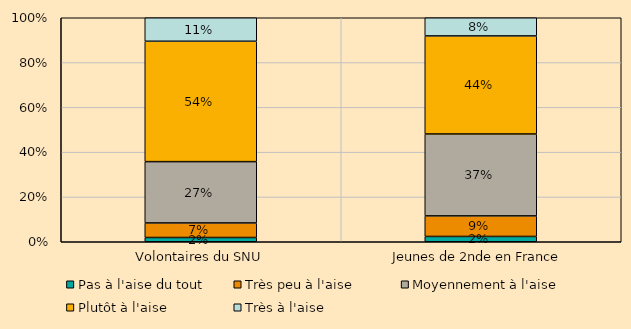
| Category | Pas à l'aise du tout | Très peu à l'aise | Moyennement à l'aise | Plutôt à l'aise | Très à l'aise |
|---|---|---|---|---|---|
| Volontaires du SNU | 0.019 | 0.065 | 0.274 | 0.538 | 0.105 |
| Jeunes de 2nde en France | 0.024 | 0.092 | 0.366 | 0.438 | 0.081 |